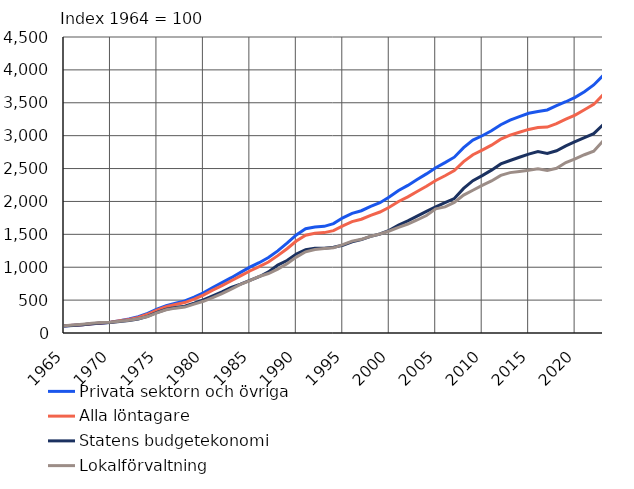
| Category | Privata sektorn och övriga | Alla löntagare | Statens budgetekonomi | Lokalförvaltning |
|---|---|---|---|---|
| 1965 | 108 | 108.6 | 107 | 112 |
| 1966 | 116 | 116.5 | 115 | 122 |
| 1967 | 126 | 126.8 | 126 | 134 |
| 1968 | 139 | 140.8 | 141 | 149 |
| 1969 | 150 | 151.2 | 151 | 158 |
| 1970 | 164 | 163.9 | 161 | 165 |
| 1971 | 188 | 184.8 | 176 | 178 |
| 1972 | 212 | 206.3 | 189 | 194 |
| 1973 | 247 | 238 | 213 | 217 |
| 1974 | 298 | 284.8 | 252 | 250 |
| 1975 | 362 | 347.2 | 312 | 307 |
| 1976 | 416 | 399.1 | 360 | 353 |
| 1977 | 453 | 432.9 | 387 | 378 |
| 1978 | 487 | 462.4 | 408 | 394 |
| 1979 | 544 | 515.3 | 452 | 439 |
| 1980 | 612 | 577.3 | 502 | 482 |
| 1981 | 692 | 651 | 565 | 538 |
| 1982 | 765 | 719.9 | 624 | 600 |
| 1983 | 840.9 | 794.5 | 692.8 | 667.7 |
| 1984 | 921.8 | 869.5 | 742.3 | 738.3 |
| 1985 | 1001.4 | 942.7 | 801.3 | 795.1 |
| 1986 | 1068.8 | 1008.4 | 855.3 | 859.6 |
| 1987 | 1146.6 | 1079.3 | 928 | 904.4 |
| 1988 | 1248.2 | 1176.2 | 1033 | 972.2 |
| 1989 | 1366.4 | 1280.6 | 1102.1 | 1052.9 |
| 1990 | 1490.8 | 1398.2 | 1201.5 | 1154 |
| 1991 | 1585.1 | 1487 | 1267.1 | 1234.2 |
| 1992 | 1611.4 | 1515.2 | 1288.3 | 1269.1 |
| 1993 | 1621.8 | 1526.2 | 1287.8 | 1285.8 |
| 1994 | 1663.5 | 1556.7 | 1302.4 | 1294.8 |
| 1995 | 1751.7 | 1629.4 | 1334.2 | 1343 |
| 1996 | 1819 | 1693 | 1386 | 1397 |
| 1997 | 1859 | 1730 | 1419 | 1424 |
| 1998 | 1925 | 1789 | 1469 | 1471 |
| 1999 | 1981 | 1839 | 1505 | 1506 |
| 2000 | 2067 | 1912 | 1560 | 1551 |
| 2001 | 2167 | 1999 | 1639 | 1606 |
| 2002 | 2244 | 2069 | 1704 | 1657 |
| 2003 | 2333 | 2151 | 1777 | 1718 |
| 2004 | 2419 | 2232 | 1848 | 1786 |
| 2005 | 2513 | 2319 | 1916 | 1888 |
| 2006 | 2590 | 2390 | 1981 | 1917 |
| 2007 | 2673 | 2469 | 2044 | 1986 |
| 2008 | 2818 | 2606 | 2198 | 2096 |
| 2009 | 2932 | 2710 | 2316 | 2170 |
| 2010 | 2999 | 2781 | 2393 | 2245 |
| 2011 | 3075 | 2856 | 2476 | 2312 |
| 2012 | 3167 | 2947 | 2571 | 2396 |
| 2013 | 3237 | 3009 | 2622 | 2438 |
| 2014 | 3290 | 3052 | 2672 | 2455 |
| 2015 | 3341 | 3095 | 2720 | 2475 |
| 2016 | 3367 | 3123 | 2757 | 2498 |
| 2017 | 3391 | 3130 | 2730 | 2472 |
| 2018 | 3455 | 3183 | 2771 | 2505 |
| 2019 | 3515.589 | 3250 | 2845.381 | 2591.118 |
| 2020 | 3582 | 3313 | 2909 | 2647 |
| 2021 | 3669 | 3393 | 2971 | 2710 |
| 2022 | 3770.941 | 3475 | 3030.565 | 2763.485 |
| 2023* | 3911.9 | 3622 | 3166.6 | 2918.5 |